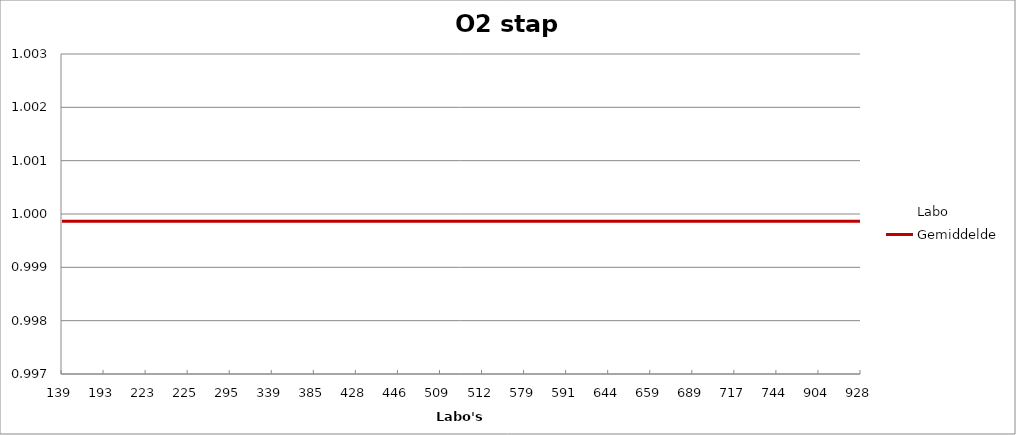
| Category | Labo | Gemiddelde |
|---|---|---|
| 139.0 | 1.002 | 1 |
| 193.0 | 1 | 1 |
| 223.0 | 1 | 1 |
| 225.0 | 1.001 | 1 |
| 295.0 | 1 | 1 |
| 339.0 | 1 | 1 |
| 385.0 | 0.999 | 1 |
| 428.0 | 1 | 1 |
| 446.0 | 1 | 1 |
| 509.0 | 1 | 1 |
| 512.0 | 1 | 1 |
| 579.0 | 1 | 1 |
| 591.0 | 1.001 | 1 |
| 644.0 | 0.999 | 1 |
| 659.0 | 1 | 1 |
| 689.0 | 1 | 1 |
| 717.0 | 0.999 | 1 |
| 744.0 | 1 | 1 |
| 904.0 | 1 | 1 |
| 928.0 | 0.998 | 1 |